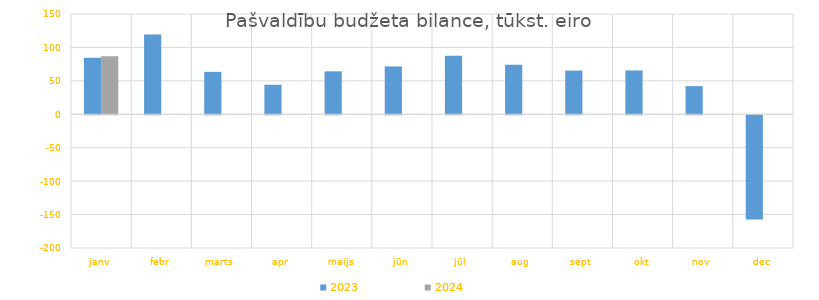
| Category | 2023 | 2024 |
|---|---|---|
| janv | 84479.098 | 86956.73 |
| febr | 119462.892 | 0 |
| marts | 63449.124 | 0 |
| apr | 44164.06 | 0 |
| maijs | 64247.066 | 0 |
| jūn | 71601.894 | 0 |
| jūl | 87551.97 | 0 |
| aug | 74225.888 | 0 |
| sept | 65410.327 | 0 |
| okt | 65576.429 | 0 |
| nov | 42139.59 | 0 |
| dec | -156000.116 | 0 |